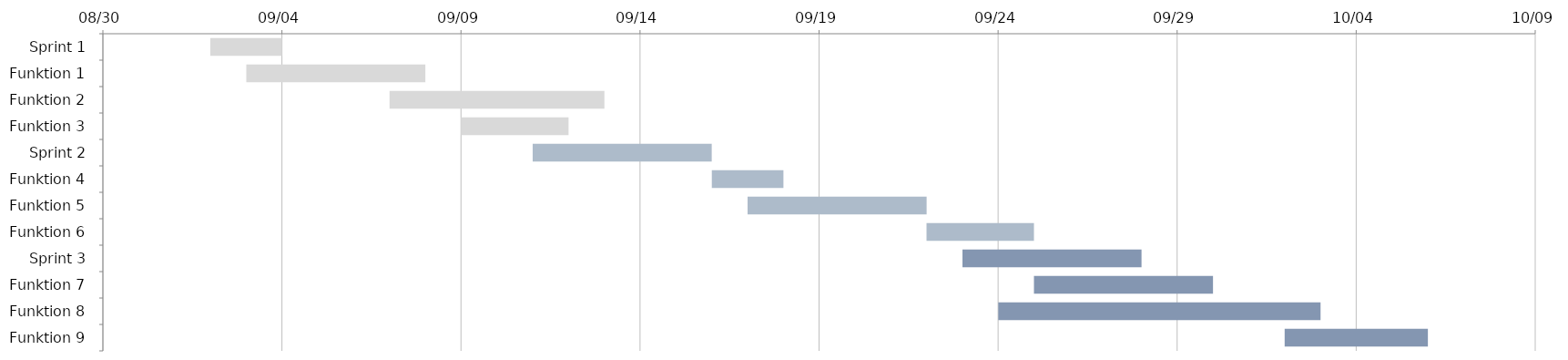
| Category | ANFANG | TAGE |
|---|---|---|
| Sprint 1 | 2022-09-02 | 2 |
| Funktion 1 | 2022-09-03 | 5 |
| Funktion 2 | 2022-09-07 | 6 |
| Funktion 3 | 2022-09-09 | 3 |
| Sprint 2 | 2022-09-11 | 5 |
| Funktion 4 | 2022-09-16 | 2 |
| Funktion 5 | 2022-09-17 | 5 |
| Funktion 6 | 2022-09-22 | 3 |
| Sprint 3 | 2022-09-23 | 5 |
| Funktion 7 | 2022-09-25 | 5 |
| Funktion 8 | 2022-09-24 | 9 |
| Funktion 9 | 2022-10-02 | 4 |